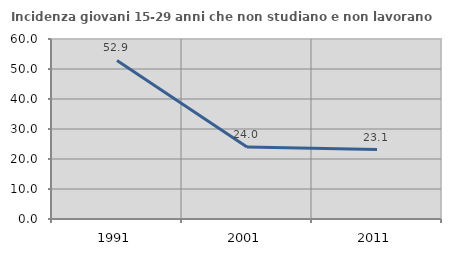
| Category | Incidenza giovani 15-29 anni che non studiano e non lavorano  |
|---|---|
| 1991.0 | 52.857 |
| 2001.0 | 23.974 |
| 2011.0 | 23.143 |